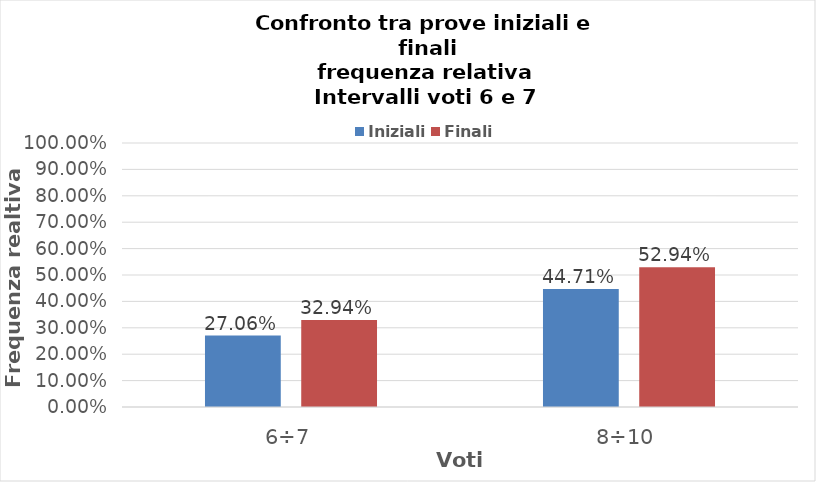
| Category | Iniziali | Finali |
|---|---|---|
| 6÷7 | 0.271 | 0.329 |
| 8÷10 | 0.447 | 0.529 |